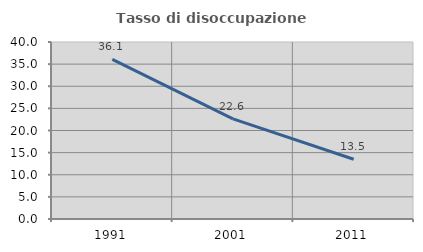
| Category | Tasso di disoccupazione giovanile  |
|---|---|
| 1991.0 | 36.082 |
| 2001.0 | 22.642 |
| 2011.0 | 13.514 |